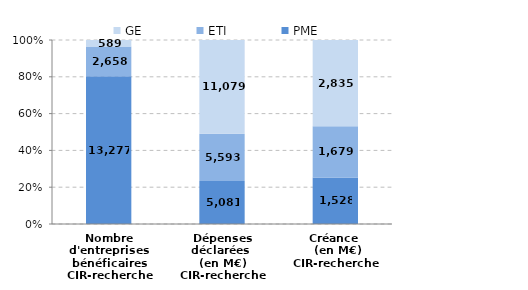
| Category | PME | ETI | GE |
|---|---|---|---|
| Nombre d'entreprises bénéficaires
CIR-recherche | 13277 | 2658 | 589 |
| Dépenses déclarées 
(en M€)
CIR-recherche | 5081.04 | 5592.82 | 11079.21 |
| Créance 
 (en M€)
CIR-recherche | 1527.51 | 1678.51 | 2834.55 |